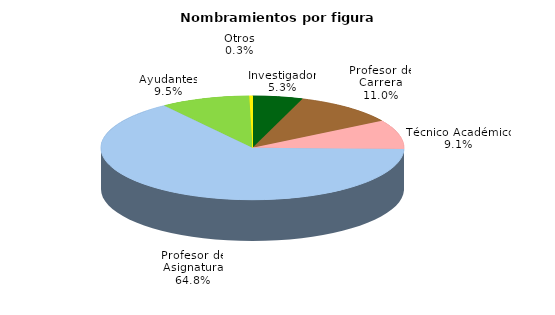
| Category | Series 0 |
|---|---|
| Investigador | 2690 |
| Profesor de Carrera | 5524 |
| Técnico Académico | 4571 |
| Profesor de Asignatura | 32709 |
| Ayudantes | 4801 |
| Otros | 173 |